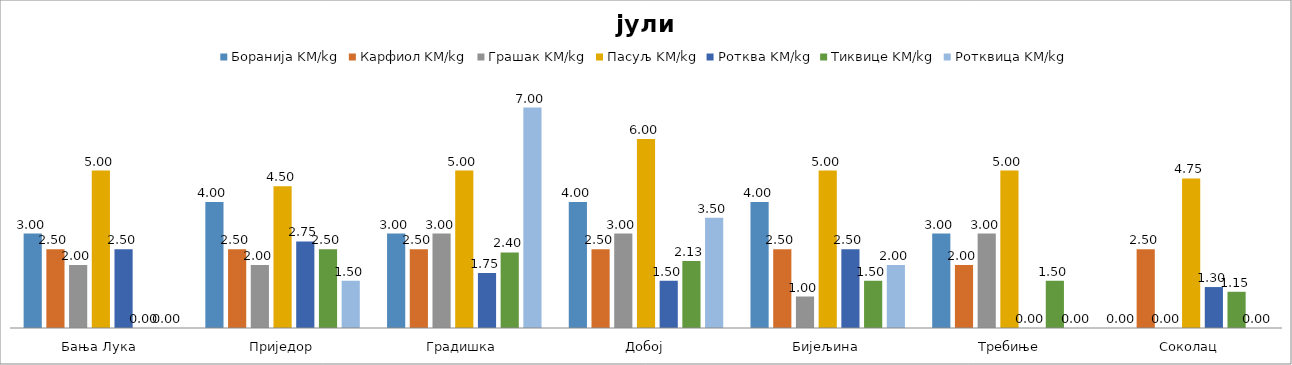
| Category | Боранија KM/kg | Карфиол KM/kg | Грашак KM/kg | Пасуљ KM/kg | Ротква KM/kg | Тиквице KM/kg | Ротквица KM/kg |
|---|---|---|---|---|---|---|---|
| Бања Лука | 3 | 2.5 | 2 | 5 | 2.5 | 0 | 0 |
| Приједор | 4 | 2.5 | 2 | 4.5 | 2.75 | 2.5 | 1.5 |
| Градишка | 3 | 2.5 | 3 | 5 | 1.75 | 2.4 | 7 |
| Добој | 4 | 2.5 | 3 | 6 | 1.5 | 2.125 | 3.5 |
| Бијељина | 4 | 2.5 | 1 | 5 | 2.5 | 1.5 | 2 |
|  Требиње | 3 | 2 | 3 | 5 | 0 | 1.5 | 0 |
| Соколац | 0 | 2.5 | 0 | 4.75 | 1.3 | 1.15 | 0 |